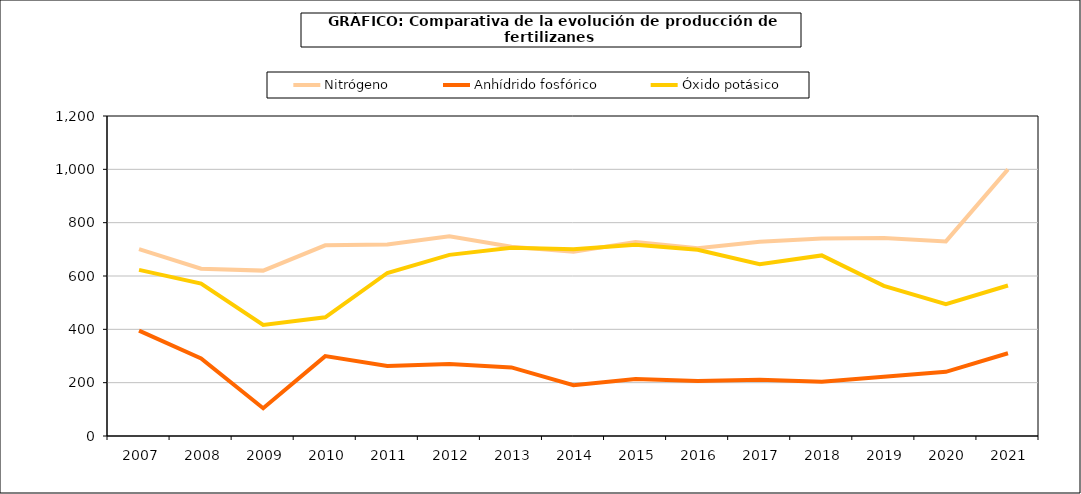
| Category | Nitrógeno | Anhídrido fosfórico | Óxido potásico |
|---|---|---|---|
|   2007 | 701.022 | 394.992 | 623.095 |
|   2008 | 627.3 | 291.1 | 571.7 |
|   2009 | 620.2 | 104.3 | 416.7 |
|   2010 | 715 | 299.5 | 445.3 |
|   2011 | 718.1 | 262.6 | 611.3 |
|   2012 | 748.9 | 269.7 | 679.2 |
|   2013 | 710 | 257.1 | 706.3 |
|   2014 | 691.1 | 190.6 | 700 |
|   2015 | 727.2 | 214 | 717.2 |
|   2016 | 703.8 | 206 | 698.2 |
|   2017 | 728 | 211.3 | 643.9 |
|   2018 | 740.8 | 203.6 | 677.2 |
|   2019 | 742.4 | 222.1 | 562.9 |
|   2020 | 729.8 | 240.7 | 494.3 |
|   2021 | 1000.004 | 310.292 | 564.4 |